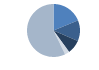
| Category | Series 0 |
|---|---|
| ARRASTRE | 254 |
| CERCO | 172 |
| PALANGRE | 115 |
| REDES DE ENMALLE | 38 |
| ARTES MENORES | 774 |
| SIN TIPO ASIGNADO | 0 |